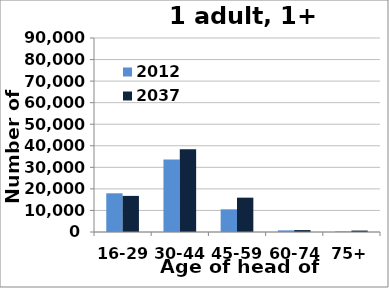
| Category | 2012 | 2037 |
|---|---|---|
| 16-29 | 17951 | 16748 |
| 30-44 | 33636 | 38334 |
| 45-59 | 10511 | 15930 |
| 60-74 | 755 | 895 |
| 75+ | 256 | 667 |